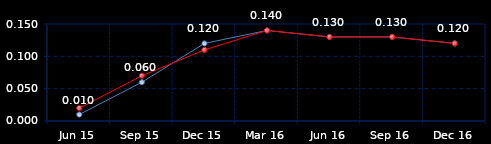
| Category | Series 0 | Series 1 |
|---|---|---|
| Jun 15 | 0.01 | 0.02 |
| Sep 15 | 0.06 | 0.07 |
| Dec 15 | 0.12 | 0.11 |
| Mar 16 | 0.14 | 0.14 |
| Jun 16 | 0.13 | 0.13 |
| Sep 16 | 0.13 | 0.13 |
| Dec 16 | 0.12 | 0.12 |